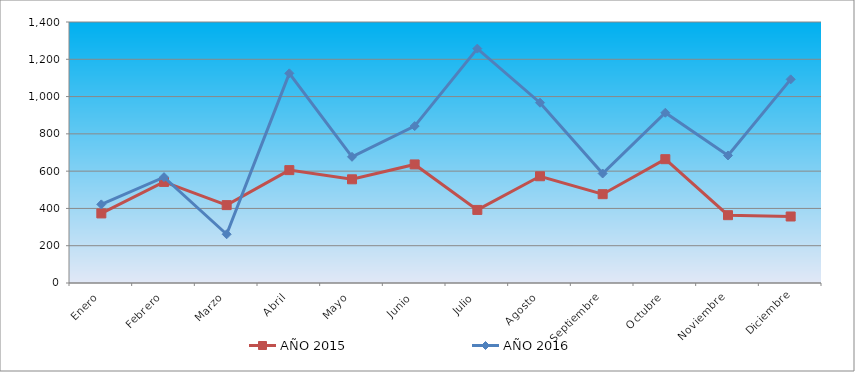
| Category | AÑO 2015 | AÑO 2016 |
|---|---|---|
| Enero | 373.144 | 421.694 |
| Febrero | 542.114 | 567.756 |
| Marzo | 417.733 | 261.459 |
| Abril | 605.478 | 1124.631 |
| Mayo | 556.195 | 676.928 |
| Junio | 635.987 | 841.683 |
| Julio | 391.918 | 1257.151 |
| Agosto | 572.623 | 967.04 |
| Septiembre | 476.403 | 587.387 |
| Octubre | 664.149 | 913.315 |
| Noviembre | 363.756 | 684.091 |
| Diciembre | 356.716 | 1092.396 |